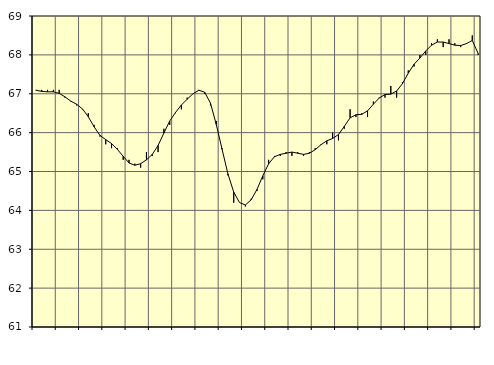
| Category | Piggar | Series 1 |
|---|---|---|
| nan | 67.1 | 67.09 |
| 1.0 | 67.1 | 67.06 |
| 1.0 | 67.1 | 67.05 |
| 1.0 | 67.1 | 67.05 |
| nan | 67.1 | 67.01 |
| 2.0 | 66.9 | 66.92 |
| 2.0 | 66.8 | 66.81 |
| 2.0 | 66.7 | 66.73 |
| nan | 66.6 | 66.61 |
| 3.0 | 66.5 | 66.41 |
| 3.0 | 66.2 | 66.15 |
| 3.0 | 65.9 | 65.93 |
| nan | 65.7 | 65.82 |
| 4.0 | 65.6 | 65.72 |
| 4.0 | 65.6 | 65.57 |
| 4.0 | 65.3 | 65.39 |
| nan | 65.3 | 65.22 |
| 5.0 | 65.2 | 65.16 |
| 5.0 | 65.1 | 65.2 |
| 5.0 | 65.5 | 65.3 |
| nan | 65.4 | 65.44 |
| 6.0 | 65.5 | 65.67 |
| 6.0 | 66.1 | 65.99 |
| 6.0 | 66.2 | 66.3 |
| nan | 66.5 | 66.52 |
| 7.0 | 66.6 | 66.71 |
| 7.0 | 66.9 | 66.86 |
| 7.0 | 67 | 67 |
| nan | 67.1 | 67.09 |
| 8.0 | 67 | 67.04 |
| 8.0 | 66.7 | 66.76 |
| 8.0 | 66.3 | 66.21 |
| nan | 65.6 | 65.57 |
| 9.0 | 64.9 | 64.94 |
| 9.0 | 64.2 | 64.47 |
| 9.0 | 64.2 | 64.2 |
| nan | 64.1 | 64.14 |
| 10.0 | 64.3 | 64.27 |
| 10.0 | 64.5 | 64.54 |
| 10.0 | 64.8 | 64.89 |
| nan | 65.3 | 65.2 |
| 11.0 | 65.4 | 65.38 |
| 11.0 | 65.4 | 65.44 |
| 11.0 | 65.5 | 65.47 |
| nan | 65.4 | 65.5 |
| 12.0 | 65.5 | 65.47 |
| 12.0 | 65.4 | 65.44 |
| 12.0 | 65.5 | 65.47 |
| nan | 65.6 | 65.56 |
| 13.0 | 65.7 | 65.69 |
| 13.0 | 65.7 | 65.79 |
| 13.0 | 66 | 65.85 |
| nan | 65.8 | 65.95 |
| 14.0 | 66.1 | 66.16 |
| 14.0 | 66.6 | 66.38 |
| 14.0 | 66.4 | 66.46 |
| nan | 66.5 | 66.47 |
| 15.0 | 66.4 | 66.56 |
| 15.0 | 66.8 | 66.73 |
| 15.0 | 66.9 | 66.89 |
| nan | 66.9 | 66.98 |
| 16.0 | 67.2 | 66.99 |
| 16.0 | 66.9 | 67.07 |
| 16.0 | 67.3 | 67.26 |
| nan | 67.6 | 67.53 |
| 17.0 | 67.7 | 67.76 |
| 17.0 | 68 | 67.92 |
| 17.0 | 68 | 68.1 |
| nan | 68.3 | 68.25 |
| 18.0 | 68.4 | 68.33 |
| 18.0 | 68.2 | 68.33 |
| 18.0 | 68.4 | 68.29 |
| nan | 68.3 | 68.25 |
| 19.0 | 68.2 | 68.24 |
| 19.0 | 68.3 | 68.29 |
| 19.0 | 68.5 | 68.37 |
| nan | 68 | 68.04 |